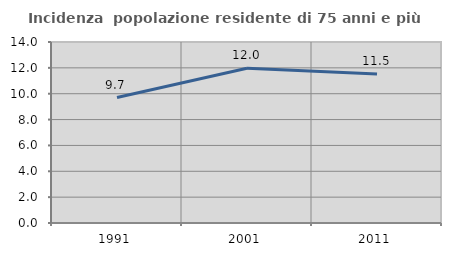
| Category | Incidenza  popolazione residente di 75 anni e più |
|---|---|
| 1991.0 | 9.701 |
| 2001.0 | 11.963 |
| 2011.0 | 11.534 |